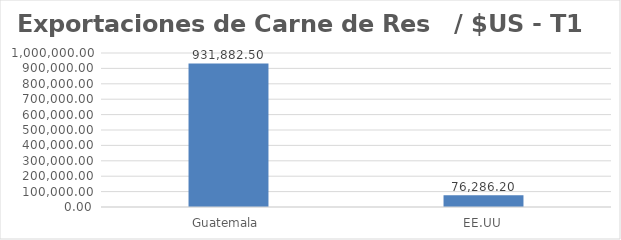
| Category | Series 0 |
|---|---|
| Guatemala  | 931882.5 |
| EE.UU | 76286.203 |